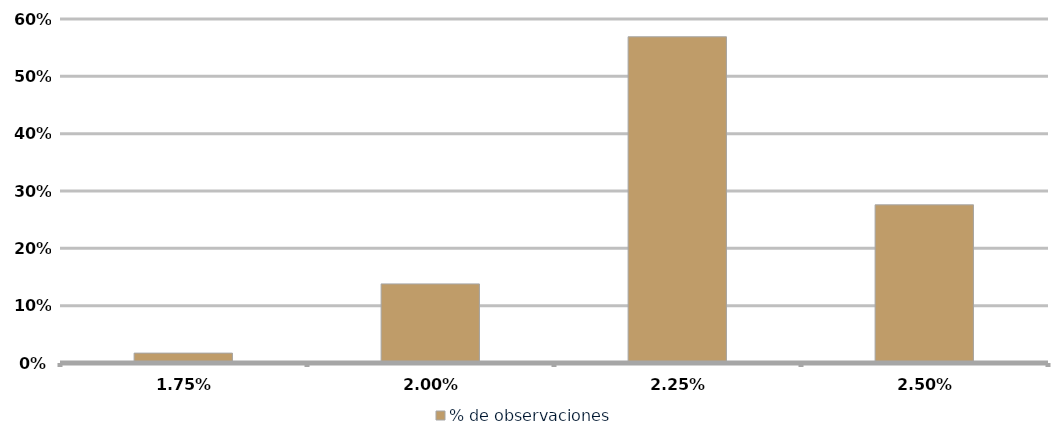
| Category | % de observaciones  |
|---|---|
| 0.0175 | 0.017 |
| 0.02 | 0.138 |
| 0.0225 | 0.569 |
| 0.024999999999999998 | 0.276 |